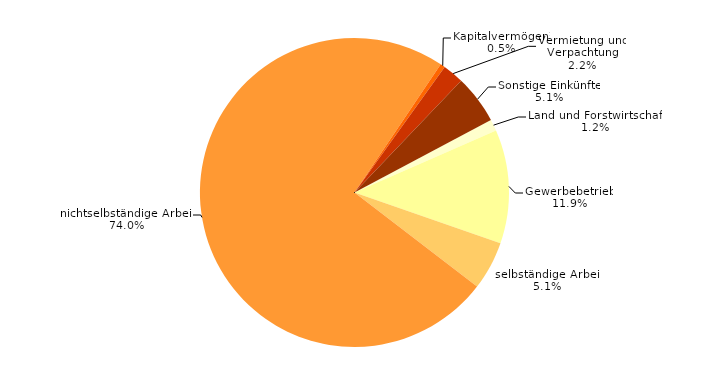
| Category | Series 0 |
|---|---|
| Land und Forstwirtschaft | 1.2 |
| Gewerbebetrieb | 11.9 |
| selbständige Arbeit | 5.1 |
| nichtselbständige Arbeit | 74 |
| Kapitalvermögen¹ | 0.5 |
| Vermietung und Verpachtung | 2.2 |
| Sonstige Einkünfte | 5.1 |